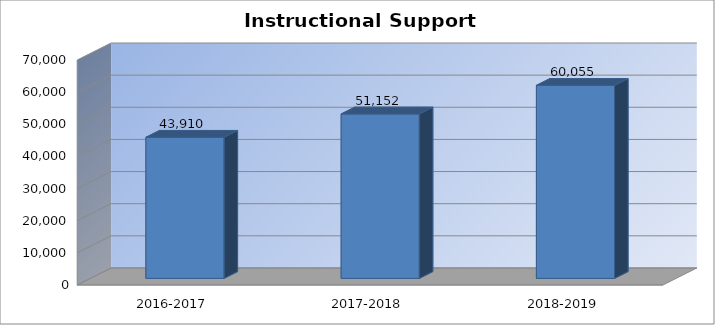
| Category | Series 0 |
|---|---|
| 2016-2017 | 43910 |
| 2017-2018 | 51152 |
| 2018-2019 | 60055 |